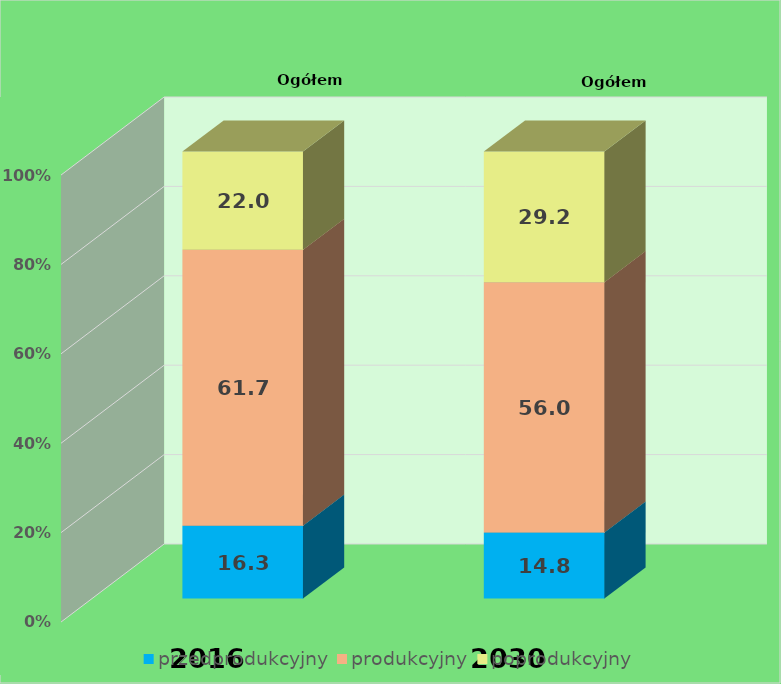
| Category | przedprodukcyjny | produkcyjny | poprodukcyjny |
|---|---|---|---|
| 2016.0 | 16.288 | 61.732 | 21.98 |
| 2030.0 | 14.763 | 56.02 | 29.217 |